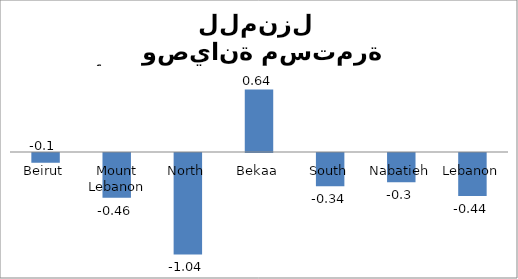
| Category | 05 |
|---|---|
| Beirut | -0.1 |
| Mount Lebanon | -0.46 |
| North | -1.04 |
| Bekaa | 0.64 |
| South | -0.34 |
| Nabatieh | -0.3 |
| Lebanon | -0.44 |